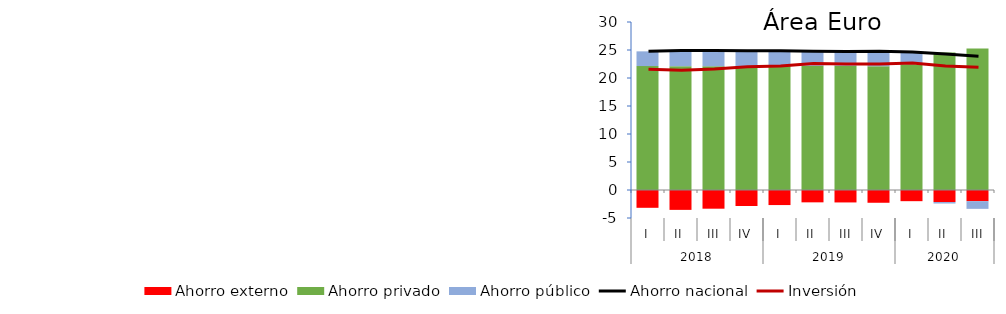
| Category | Ahorro externo | Ahorro privado | Ahorro público |
|---|---|---|---|
| 0 | -3.179 | 22.133 | 2.625 |
| 1 | -3.548 | 22.105 | 2.814 |
| 2 | -3.338 | 22.091 | 2.838 |
| 3 | -2.86 | 22.094 | 2.769 |
| 4 | -2.69 | 22.189 | 2.666 |
| 5 | -2.203 | 22.178 | 2.597 |
| 6 | -2.222 | 22.183 | 2.541 |
| 7 | -2.279 | 22.098 | 2.67 |
| 8 | -1.995 | 22.439 | 2.216 |
| 9 | -2.149 | 24.552 | -0.266 |
| 10 | -1.993 | 25.264 | -1.372 |